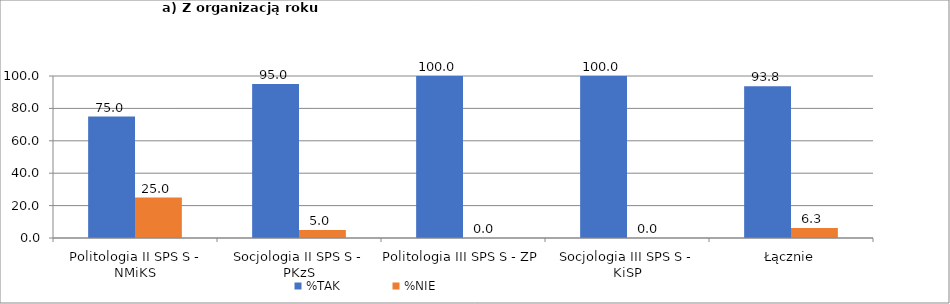
| Category | %TAK | %NIE |
|---|---|---|
| Politologia II SPS S - NMiKS | 75 | 25 |
| Socjologia II SPS S - PKzS | 95 | 5 |
| Politologia III SPS S - ZP | 100 | 0 |
| Socjologia III SPS S - KiSP | 100 | 0 |
| Łącznie | 93.75 | 6.25 |